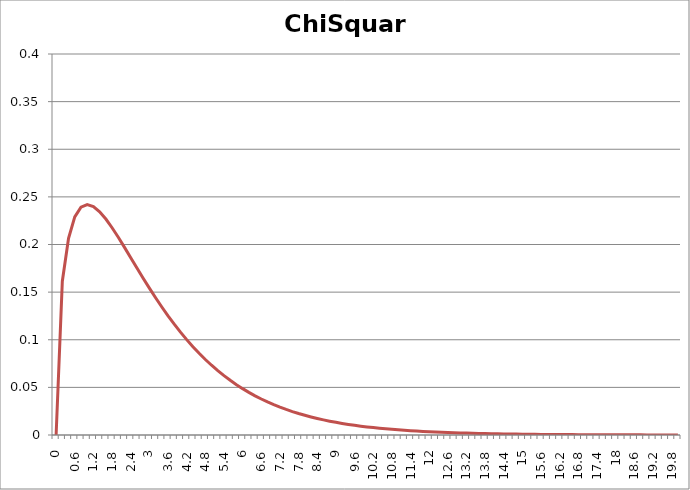
| Category | ChiSquare |
|---|---|
| 0.0 | 0 |
| 0.2 | 0.161 |
| 0.4 | 0.207 |
| 0.6 | 0.229 |
| 0.8 | 0.239 |
| 1.0 | 0.242 |
| 1.2 | 0.24 |
| 1.4 | 0.234 |
| 1.6 | 0.227 |
| 1.8 | 0.218 |
| 2.0 | 0.208 |
| 2.2 | 0.197 |
| 2.4 | 0.186 |
| 2.6 | 0.175 |
| 2.8 | 0.165 |
| 3.0 | 0.154 |
| 3.2 | 0.144 |
| 3.4 | 0.134 |
| 3.6 | 0.125 |
| 3.8 | 0.116 |
| 4.0 | 0.108 |
| 4.2 | 0.1 |
| 4.4 | 0.093 |
| 4.6 | 0.086 |
| 4.8 | 0.079 |
| 5.0 | 0.073 |
| 5.2 | 0.068 |
| 5.4 | 0.062 |
| 5.6 | 0.057 |
| 5.8 | 0.053 |
| 6.0 | 0.049 |
| 6.2 | 0.045 |
| 6.4 | 0.041 |
| 6.6 | 0.038 |
| 6.8 | 0.035 |
| 7.0 | 0.032 |
| 7.2 | 0.029 |
| 7.4 | 0.027 |
| 7.6 | 0.025 |
| 7.8 | 0.023 |
| 8.0 | 0.021 |
| 8.2 | 0.019 |
| 8.4 | 0.017 |
| 8.6 | 0.016 |
| 8.8 | 0.015 |
| 9.0 | 0.013 |
| 9.2 | 0.012 |
| 9.4 | 0.011 |
| 9.6 | 0.01 |
| 9.8 | 0.009 |
| 10.0 | 0.009 |
| 10.2 | 0.008 |
| 10.4 | 0.007 |
| 10.6 | 0.006 |
| 10.8 | 0.006 |
| 11.0 | 0.005 |
| 11.2 | 0.005 |
| 11.4 | 0.005 |
| 11.6 | 0.004 |
| 11.8 | 0.004 |
| 12.0 | 0.003 |
| 12.2 | 0.003 |
| 12.4 | 0.003 |
| 12.6 | 0.003 |
| 12.8 | 0.002 |
| 13.0 | 0.002 |
| 13.2 | 0.002 |
| 13.4 | 0.002 |
| 13.6 | 0.002 |
| 13.8 | 0.001 |
| 14.0 | 0.001 |
| 14.2 | 0.001 |
| 14.4 | 0.001 |
| 14.6 | 0.001 |
| 14.8 | 0.001 |
| 15.0 | 0.001 |
| 15.2 | 0.001 |
| 15.4 | 0.001 |
| 15.6 | 0.001 |
| 15.8 | 0.001 |
| 16.0 | 0.001 |
| 16.2 | 0 |
| 16.4 | 0 |
| 16.6 | 0 |
| 16.8 | 0 |
| 17.0 | 0 |
| 17.2 | 0 |
| 17.4 | 0 |
| 17.6 | 0 |
| 17.8 | 0 |
| 18.0 | 0 |
| 18.2 | 0 |
| 18.4 | 0 |
| 18.6 | 0 |
| 18.8 | 0 |
| 19.0 | 0 |
| 19.2 | 0 |
| 19.4 | 0 |
| 19.6 | 0 |
| 19.8 | 0 |
| 20.0 | 0 |